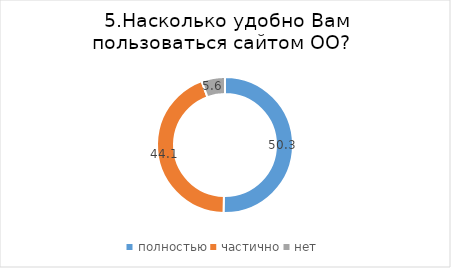
| Category | Series 0 |
|---|---|
| полностью | 50.35 |
| частично | 44.056 |
| нет | 5.594 |